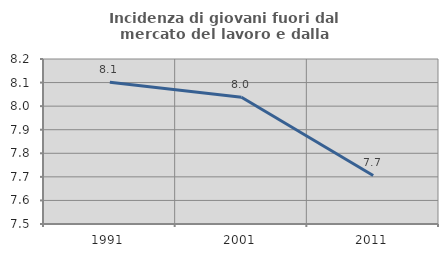
| Category | Incidenza di giovani fuori dal mercato del lavoro e dalla formazione  |
|---|---|
| 1991.0 | 8.101 |
| 2001.0 | 8.037 |
| 2011.0 | 7.706 |